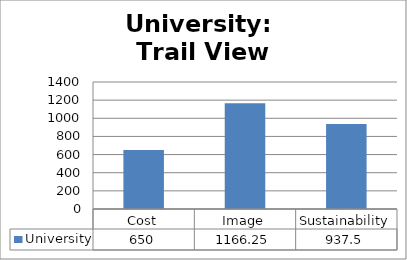
| Category | University |
|---|---|
| Cost | 650 |
| Image | 1166.25 |
| Sustainability | 937.5 |